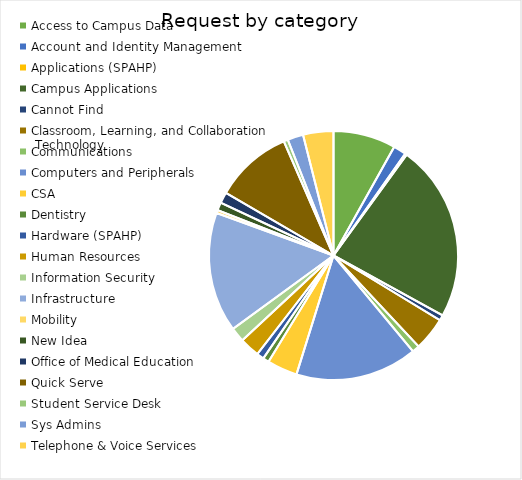
| Category | Series 0 |
|---|---|
| Access to Campus Data | 103 |
| Account and Identity Management | 21 |
| Applications (SPAHP) | 3 |
| Campus Applications | 292 |
| Cannot Find | 9 |
| Classroom, Learning, and Collaboration Technology | 55 |
| Communications | 12 |
| Computers and Peripherals | 201 |
| CSA | 50 |
| Dentistry | 10 |
| Hardware (SPAHP) | 12 |
| Human Resources | 33 |
| Information Security | 24 |
| Infrastructure | 198 |
| Mobility | 5 |
| New Idea | 13 |
| Office of Medical Education | 18 |
| Quick Serve | 128 |
| Student Service Desk | 7 |
| Sys Admins | 26 |
| Telephone & Voice Services | 50 |